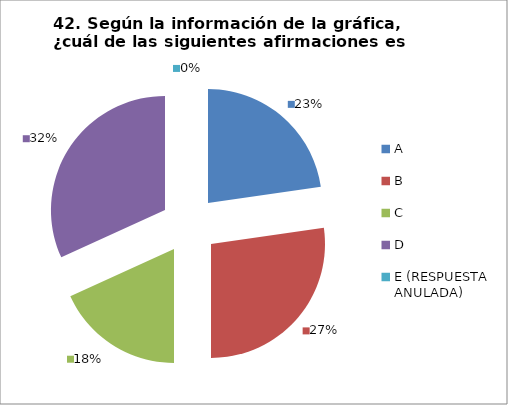
| Category | CANTIDAD DE RESPUESTAS PREGUNTA (42) | PORCENTAJE |
|---|---|---|
| A | 5 | 0.227 |
| B | 6 | 0.273 |
| C | 4 | 0.182 |
| D | 7 | 0.318 |
| E (RESPUESTA ANULADA) | 0 | 0 |